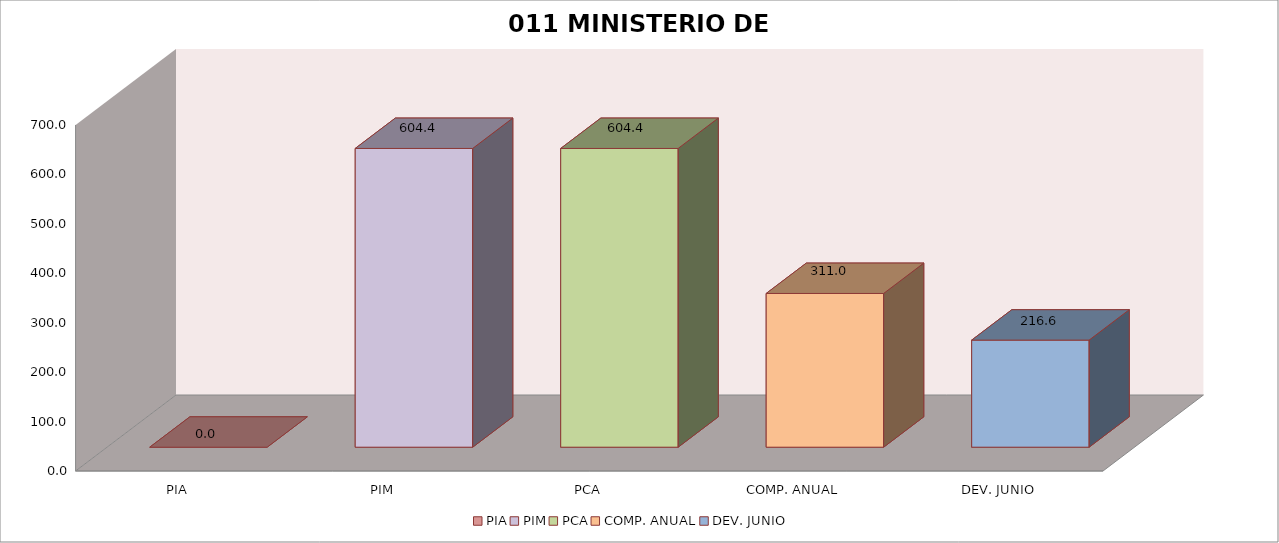
| Category | 011 MINISTERIO DE SALUD |
|---|---|
| PIA | 0 |
| PIM | 604.374 |
| PCA | 604.374 |
| COMP. ANUAL | 311.005 |
| DEV. JUNIO | 216.639 |